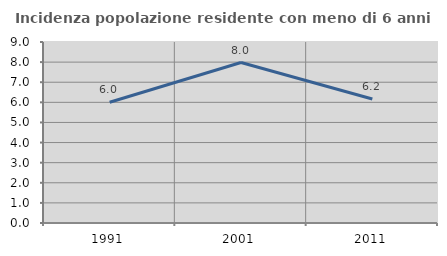
| Category | Incidenza popolazione residente con meno di 6 anni |
|---|---|
| 1991.0 | 6.002 |
| 2001.0 | 7.979 |
| 2011.0 | 6.163 |